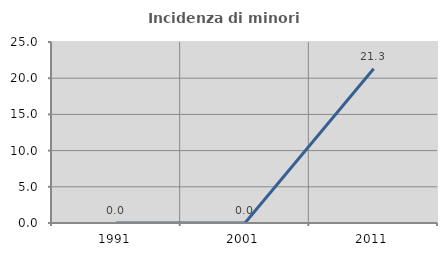
| Category | Incidenza di minori stranieri |
|---|---|
| 1991.0 | 0 |
| 2001.0 | 0 |
| 2011.0 | 21.296 |